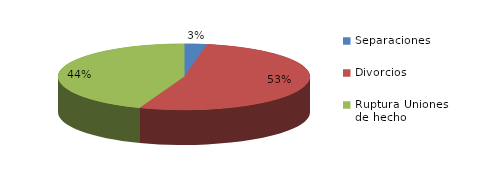
| Category | Series 0 |
|---|---|
| Separaciones | 37 |
| Divorcios | 674 |
| Ruptura Uniones de hecho | 566 |